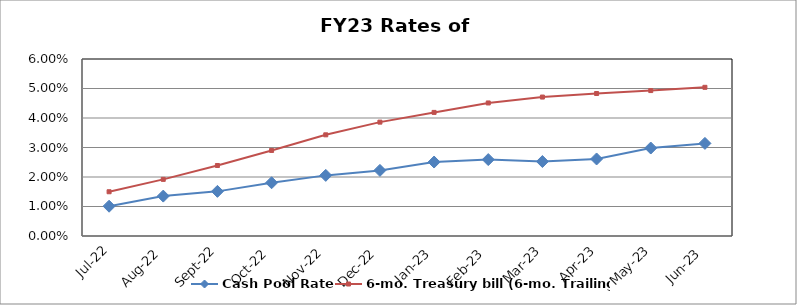
| Category | Cash Pool Rate | 6-mo. Treasury bill (6-mo. Trailing) |
|---|---|---|
| 2022-07-31 | 0.01 | 0.015 |
| 2022-08-31 | 0.014 | 0.019 |
| 2022-09-30 | 0.015 | 0.024 |
| 2022-10-31 | 0.018 | 0.029 |
| 2022-11-30 | 0.021 | 0.034 |
| 2022-12-31 | 0.022 | 0.039 |
| 2023-01-31 | 0.025 | 0.042 |
| 2023-02-28 | 0.026 | 0.045 |
| 2023-03-31 | 0.025 | 0.047 |
| 2023-04-30 | 0.026 | 0.048 |
| 2023-05-31 | 0.03 | 0.049 |
| 2023-06-30 | 0.031 | 0.05 |